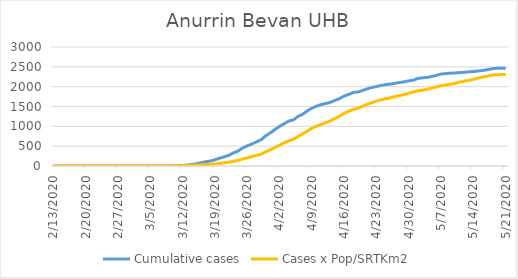
| Category | Cumulative cases | Cases x Pop/SRTKm2 |
|---|---|---|
| 5/21/20 | 2462 | 2303.673 |
| 5/20/20 | 2462 | 2303.673 |
| 5/19/20 | 2462 | 2303.132 |
| 5/18/20 | 2453 | 2290.505 |
| 5/17/20 | 2427 | 2263.628 |
| 5/16/20 | 2408 | 2243.606 |
| 5/15/20 | 2394 | 2215.466 |
| 5/14/20 | 2382 | 2184.26 |
| 5/13/20 | 2375 | 2162.614 |
| 5/12/20 | 2361 | 2137.721 |
| 5/11/20 | 2355 | 2113.008 |
| 5/10/20 | 2345 | 2082.343 |
| 5/9/20 | 2340 | 2064.485 |
| 5/8/20 | 2330 | 2042.118 |
| 5/7/20 | 2319 | 2024.08 |
| 5/6/20 | 2285 | 1994.316 |
| 5/5/20 | 2257 | 1964.553 |
| 5/4/20 | 2233 | 1935.872 |
| 5/3/20 | 2222 | 1912.783 |
| 5/2/20 | 2209 | 1895.827 |
| 5/1/20 | 2164 | 1865.703 |
| 4/30/20 | 2146 | 1837.203 |
| 4/29/20 | 2122 | 1802.569 |
| 4/28/20 | 2105 | 1773.167 |
| 4/27/20 | 2085 | 1746.831 |
| 4/26/20 | 2065 | 1717.248 |
| 4/25/20 | 2052 | 1695.782 |
| 4/24/20 | 2031 | 1671.43 |
| 4/23/20 | 2004 | 1634.091 |
| 4/22/20 | 1979 | 1598.375 |
| 4/21/20 | 1945 | 1553.099 |
| 4/20/20 | 1906 | 1507.462 |
| 4/19/20 | 1867 | 1457.857 |
| 4/18/20 | 1854 | 1425.749 |
| 4/17/20 | 1805 | 1381.915 |
| 4/16/20 | 1763 | 1323.832 |
| 4/15/20 | 1701 | 1259.075 |
| 4/14/20 | 1652 | 1195.038 |
| 4/13/20 | 1605 | 1139.12 |
| 4/12/20 | 1573 | 1090.957 |
| 4/11/20 | 1548 | 1047.124 |
| 4/10/20 | 1508 | 1003.111 |
| 4/9/20 | 1455 | 948.996 |
| 4/8/20 | 1391 | 878.646 |
| 4/7/20 | 1303 | 809.56 |
| 4/6/20 | 1248 | 741.736 |
| 4/5/20 | 1162 | 673.37 |
| 4/4/20 | 1133 | 633.506 |
| 4/3/20 | 1065 | 582.818 |
| 4/2/20 | 998 | 524.374 |
| 4/1/20 | 918 | 464.306 |
| 3/31/20 | 834 | 406.584 |
| 3/30/20 | 761 | 357.7 |
| 3/29/20 | 661 | 297.452 |
| 3/28/20 | 607 | 269.312 |
| 3/27/20 | 554 | 239.368 |
| 3/26/20 | 507 | 205.998 |
| 3/25/20 | 454 | 174.611 |
| 3/24/20 | 375 | 141.601 |
| 3/23/20 | 330 | 117.249 |
| 3/22/20 | 269 | 93.799 |
| 3/21/20 | 231 | 80.09 |
| 3/20/20 | 197 | 66.561 |
| 3/19/20 | 158 | 53.574 |
| 3/18/20 | 125 | 42.751 |
| 3/17/20 | 106 | 36.437 |
| 3/16/20 | 82 | 29.763 |
| 3/15/20 | 59 | 23.63 |
| 3/14/20 | 37 | 18.399 |
| 3/13/20 | 25 | 14.972 |
| 3/12/20 | 13 | 10.101 |
| 3/11/20 | 6 | 5.772 |
| 3/10/20 | 1 | 3.247 |
| 3/9/20 | 0 | 1.263 |
| 3/8/20 | 0 | 0.722 |
| 3/7/20 | 0 | 0.722 |
| 3/6/20 | 0 | 0.361 |
| 3/5/20 | 0 | 0.361 |
| 3/4/20 | 0 | 0.361 |
| 3/3/20 | 0 | 0.18 |
| 3/2/20 | 0 | 0.18 |
| 3/1/20 | 0 | 0.18 |
| 2/29/20 | 0 | 0.18 |
| 2/28/20 | 0 | 0.18 |
| 2/27/20 | 0 | 0.18 |
| 2/26/20 | 0 | 0 |
| 2/25/20 | 0 | 0 |
| 2/24/20 | 0 | 0 |
| 2/23/20 | 0 | 0 |
| 2/22/20 | 0 | 0 |
| 2/21/20 | 0 | 0 |
| 2/20/20 | 0 | 0 |
| 2/19/20 | 0 | 0 |
| 2/18/20 | 0 | 0 |
| 2/17/20 | 0 | 0 |
| 2/16/20 | 0 | 0 |
| 2/15/20 | 0 | 0 |
| 2/14/20 | 0 | 0 |
| 2/13/20 | 0 | 0 |